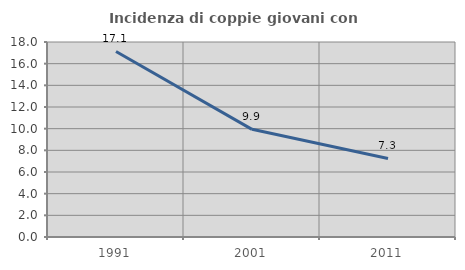
| Category | Incidenza di coppie giovani con figli |
|---|---|
| 1991.0 | 17.126 |
| 2001.0 | 9.939 |
| 2011.0 | 7.253 |